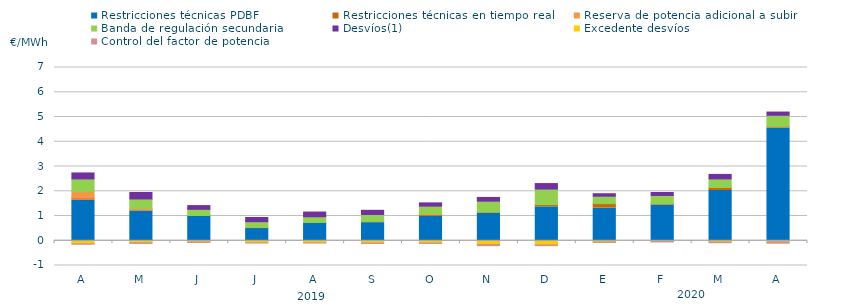
| Category | Restricciones técnicas PDBF | Restricciones técnicas en tiempo real | Reserva de potencia adicional a subir | Banda de regulación secundaria | Desvíos(1) | Excedente desvíos | Control del factor de potencia |
|---|---|---|---|---|---|---|---|
| A | 1.64 | 0.08 | 0.27 | 0.51 | 0.24 | -0.12 | -0.06 |
| M | 1.21 | 0.03 | 0.06 | 0.39 | 0.26 | -0.08 | -0.07 |
| J | 1.01 | 0.01 | 0 | 0.25 | 0.15 | -0.05 | -0.06 |
| J | 0.51 | 0.02 | 0.01 | 0.23 | 0.17 | -0.08 | -0.05 |
| A | 0.73 | 0.01 | 0 | 0.23 | 0.19 | -0.08 | -0.05 |
| S | 0.73 | 0.05 | 0 | 0.28 | 0.17 | -0.09 | -0.06 |
| O | 0.98 | 0.07 | 0.03 | 0.32 | 0.13 | -0.09 | -0.06 |
| N | 1.11 | 0.05 | 0 | 0.44 | 0.15 | -0.15 | -0.09 |
| D | 1.37 | 0.09 | 0 | 0.63 | 0.22 | -0.17 | -0.07 |
| E | 1.32 | 0.18 | 0 | 0.3 | 0.1 | -0.05 | -0.06 |
| F | 1.44 | 0.06 | 0 | 0.33 | 0.12 | -0.03 | -0.06 |
| M | 2.03 | 0.12 | 0 | 0.35 | 0.18 | -0.05 | -0.07 |
| A | 4.55 | 0.07 | 0 | 0.45 | 0.13 | -0.04 | -0.1 |